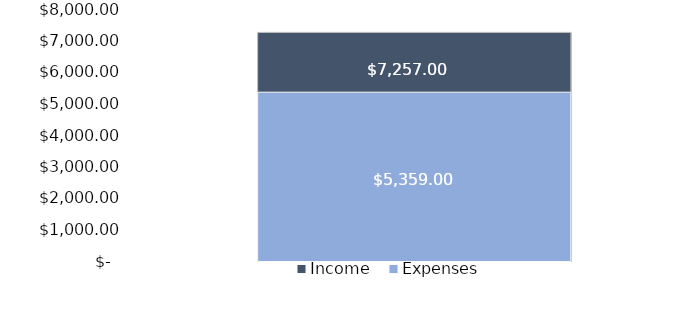
| Category | Income | Expenses |
|---|---|---|
| 0 | 7257 | 5359 |